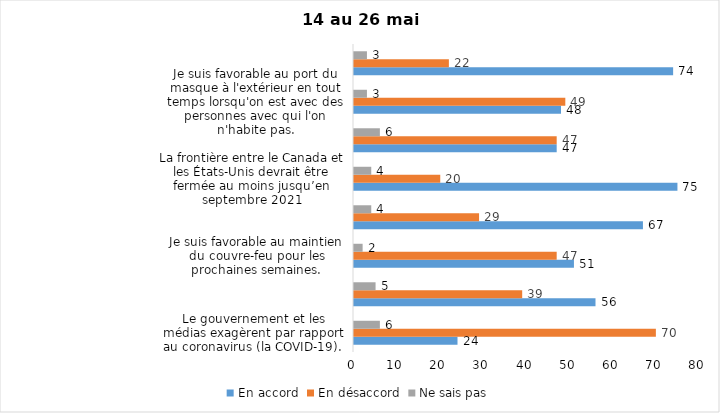
| Category | En accord | En désaccord | Ne sais pas |
|---|---|---|---|
| Le gouvernement et les médias exagèrent par rapport au coronavirus (la COVID-19). | 24 | 70 | 6 |
| J’ai peur que le système de santé soit débordé par les cas de COVID-19 suite au "déconfinement" | 56 | 39 | 5 |
| Je suis favorable au maintien du couvre-feu pour les prochaines semaines. | 51 | 47 | 2 |
| Je suis inquiet/inquiète  que le nombre de cas augmente en raison des nouveaux variants du virus de la COVID-19 | 67 | 29 | 4 |
| La frontière entre le Canada et les États-Unis devrait être fermée au moins jusqu’en septembre 2021 | 75 | 20 | 4 |
| Les personnes vaccinées contre la COVID-19 devraient avoir le droit de faire des rassemblements privés et de ne plus porter le masque dans les lieux publics. | 47 | 47 | 6 |
| Je suis favorable au port du masque à l'extérieur en tout temps lorsqu'on est avec des personnes avec qui l'on n'habite pas. | 48 | 49 | 3 |
| Je suis favorable au passeport vaccinal qui permettrait l'accès à certains lieux ou activités aux personnes vaccinées. | 74 | 22 | 3 |